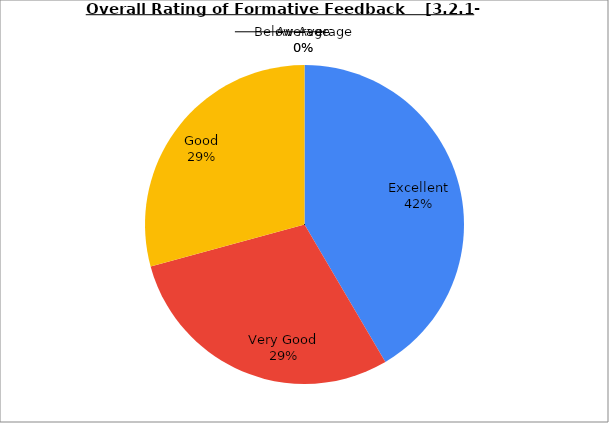
| Category | Series 0 |
|---|---|
| Excellent | 41.538 |
| Very Good | 29.231 |
| Good | 29.231 |
| Average | 0 |
| Below Average | 0 |